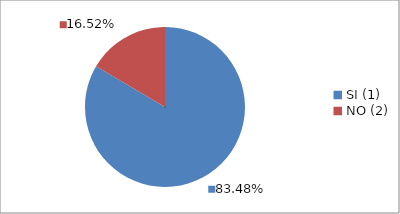
| Category | Series 0 |
|---|---|
| SI (1) | 0.835 |
| NO (2) | 0.165 |